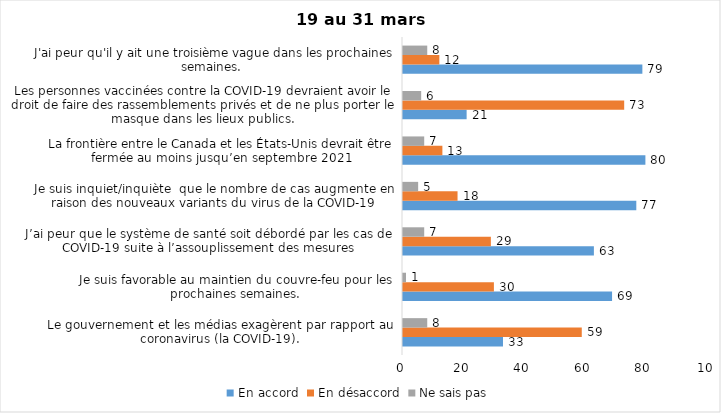
| Category | En accord | En désaccord | Ne sais pas |
|---|---|---|---|
| Le gouvernement et les médias exagèrent par rapport au coronavirus (la COVID-19). | 33 | 59 | 8 |
| Je suis favorable au maintien du couvre-feu pour les prochaines semaines. | 69 | 30 | 1 |
| J’ai peur que le système de santé soit débordé par les cas de COVID-19 suite à l’assouplissement des mesures | 63 | 29 | 7 |
| Je suis inquiet/inquiète  que le nombre de cas augmente en raison des nouveaux variants du virus de la COVID-19 | 77 | 18 | 5 |
| La frontière entre le Canada et les États-Unis devrait être fermée au moins jusqu’en septembre 2021 | 80 | 13 | 7 |
| Les personnes vaccinées contre la COVID-19 devraient avoir le droit de faire des rassemblements privés et de ne plus porter le masque dans les lieux publics. | 21 | 73 | 6 |
| J'ai peur qu'il y ait une troisième vague dans les prochaines semaines.  | 79 | 12 | 8 |